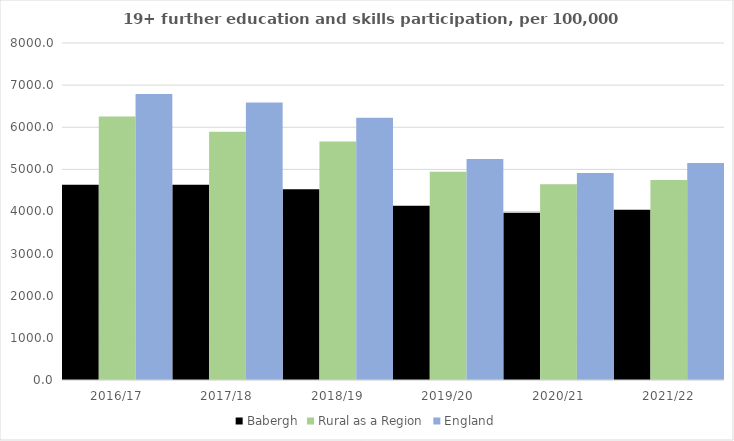
| Category | Babergh | Rural as a Region | England |
|---|---|---|---|
| 2016/17 | 4635 | 6253.401 | 6788 |
| 2017/18 | 4636 | 5892.029 | 6588 |
| 2018/19 | 4526 | 5661.873 | 6227 |
| 2019/20 | 4137 | 4943.801 | 5244 |
| 2020/21 | 3971 | 4646.727 | 4913 |
| 2021/22 | 4039 | 4747.049 | 5151 |